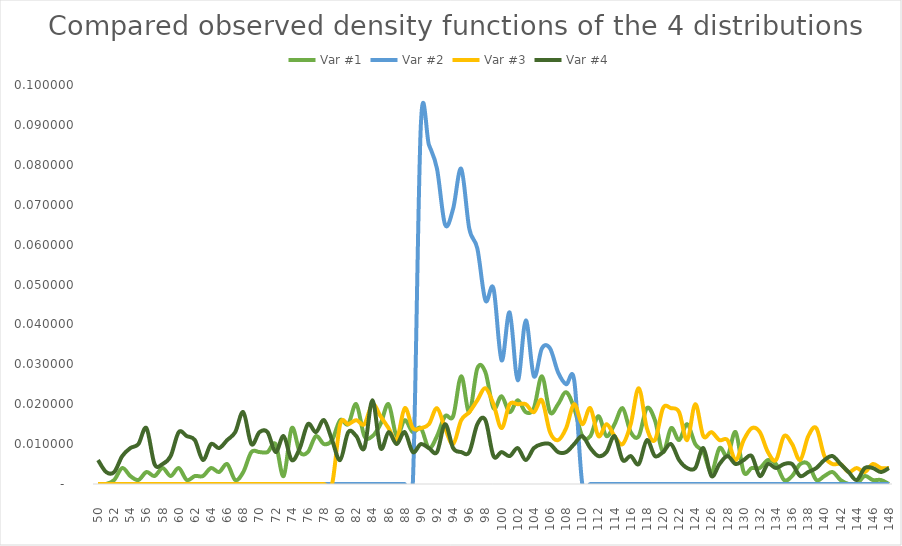
| Category | Var #1 | Var #2 | Var #3 | Var #4 |
|---|---|---|---|---|
| 50.0 | 0 | 0 | 0 | 0.006 |
| 51.0 | 0 | 0 | 0 | 0.003 |
| 52.0 | 0.001 | 0 | 0 | 0.003 |
| 53.0 | 0.004 | 0 | 0 | 0.007 |
| 54.0 | 0.002 | 0 | 0 | 0.009 |
| 55.0 | 0.001 | 0 | 0 | 0.01 |
| 56.0 | 0.003 | 0 | 0 | 0.014 |
| 57.0 | 0.002 | 0 | 0 | 0.005 |
| 58.0 | 0.004 | 0 | 0 | 0.005 |
| 59.0 | 0.002 | 0 | 0 | 0.007 |
| 60.0 | 0.004 | 0 | 0 | 0.013 |
| 61.0 | 0.001 | 0 | 0 | 0.012 |
| 62.0 | 0.002 | 0 | 0 | 0.011 |
| 63.0 | 0.002 | 0 | 0 | 0.006 |
| 64.0 | 0.004 | 0 | 0 | 0.01 |
| 65.0 | 0.003 | 0 | 0 | 0.009 |
| 66.0 | 0.005 | 0 | 0 | 0.011 |
| 67.0 | 0.001 | 0 | 0 | 0.013 |
| 68.0 | 0.003 | 0 | 0 | 0.018 |
| 69.0 | 0.008 | 0 | 0 | 0.01 |
| 70.0 | 0.008 | 0 | 0 | 0.013 |
| 71.0 | 0.008 | 0 | 0 | 0.013 |
| 72.0 | 0.01 | 0 | 0 | 0.008 |
| 73.0 | 0.002 | 0 | 0 | 0.012 |
| 74.0 | 0.014 | 0 | 0 | 0.006 |
| 75.0 | 0.008 | 0 | 0 | 0.009 |
| 76.0 | 0.008 | 0 | 0 | 0.015 |
| 77.0 | 0.012 | 0 | 0 | 0.013 |
| 78.0 | 0.01 | 0 | 0 | 0.016 |
| 79.0 | 0.011 | 0 | 0 | 0.011 |
| 80.0 | 0.016 | 0 | 0.015 | 0.006 |
| 81.0 | 0.015 | 0 | 0.015 | 0.013 |
| 82.0 | 0.02 | 0 | 0.016 | 0.012 |
| 83.0 | 0.012 | 0 | 0.015 | 0.009 |
| 84.0 | 0.012 | 0 | 0.02 | 0.021 |
| 85.0 | 0.015 | 0 | 0.017 | 0.009 |
| 86.0 | 0.02 | 0 | 0.014 | 0.013 |
| 87.0 | 0.012 | 0 | 0.011 | 0.01 |
| 88.0 | 0.016 | 0 | 0.019 | 0.013 |
| 89.0 | 0.013 | 0 | 0.014 | 0.008 |
| 90.0 | 0.014 | 0.09 | 0.014 | 0.01 |
| 91.0 | 0.009 | 0.085 | 0.015 | 0.009 |
| 92.0 | 0.012 | 0.079 | 0.019 | 0.008 |
| 93.0 | 0.017 | 0.065 | 0.014 | 0.015 |
| 94.0 | 0.017 | 0.069 | 0.01 | 0.009 |
| 95.0 | 0.027 | 0.079 | 0.016 | 0.008 |
| 96.0 | 0.018 | 0.064 | 0.018 | 0.008 |
| 97.0 | 0.029 | 0.059 | 0.021 | 0.015 |
| 98.0 | 0.028 | 0.046 | 0.024 | 0.016 |
| 99.0 | 0.019 | 0.049 | 0.02 | 0.007 |
| 100.0 | 0.022 | 0.031 | 0.014 | 0.008 |
| 101.0 | 0.018 | 0.043 | 0.02 | 0.007 |
| 102.0 | 0.021 | 0.026 | 0.02 | 0.009 |
| 103.0 | 0.018 | 0.041 | 0.02 | 0.006 |
| 104.0 | 0.019 | 0.027 | 0.018 | 0.009 |
| 105.0 | 0.027 | 0.034 | 0.021 | 0.01 |
| 106.0 | 0.018 | 0.034 | 0.013 | 0.01 |
| 107.0 | 0.02 | 0.028 | 0.011 | 0.008 |
| 108.0 | 0.023 | 0.025 | 0.014 | 0.008 |
| 109.0 | 0.019 | 0.026 | 0.02 | 0.01 |
| 110.0 | 0.012 | 0 | 0.015 | 0.012 |
| 111.0 | 0.012 | 0 | 0.019 | 0.009 |
| 112.0 | 0.017 | 0 | 0.012 | 0.007 |
| 113.0 | 0.012 | 0 | 0.015 | 0.008 |
| 114.0 | 0.015 | 0 | 0.012 | 0.012 |
| 115.0 | 0.019 | 0 | 0.01 | 0.006 |
| 116.0 | 0.013 | 0 | 0.015 | 0.007 |
| 117.0 | 0.012 | 0 | 0.024 | 0.005 |
| 118.0 | 0.019 | 0 | 0.014 | 0.011 |
| 119.0 | 0.016 | 0 | 0.011 | 0.007 |
| 120.0 | 0.008 | 0 | 0.019 | 0.008 |
| 121.0 | 0.014 | 0 | 0.019 | 0.01 |
| 122.0 | 0.011 | 0 | 0.018 | 0.006 |
| 123.0 | 0.015 | 0 | 0.011 | 0.004 |
| 124.0 | 0.01 | 0 | 0.02 | 0.004 |
| 125.0 | 0.008 | 0 | 0.012 | 0.009 |
| 126.0 | 0.003 | 0 | 0.013 | 0.002 |
| 127.0 | 0.009 | 0 | 0.011 | 0.005 |
| 128.0 | 0.007 | 0 | 0.011 | 0.007 |
| 129.0 | 0.013 | 0 | 0.006 | 0.005 |
| 130.0 | 0.003 | 0 | 0.011 | 0.006 |
| 131.0 | 0.004 | 0 | 0.014 | 0.007 |
| 132.0 | 0.004 | 0 | 0.013 | 0.002 |
| 133.0 | 0.006 | 0 | 0.008 | 0.005 |
| 134.0 | 0.005 | 0 | 0.006 | 0.004 |
| 135.0 | 0.001 | 0 | 0.012 | 0.005 |
| 136.0 | 0.002 | 0 | 0.01 | 0.005 |
| 137.0 | 0.005 | 0 | 0.006 | 0.002 |
| 138.0 | 0.005 | 0 | 0.012 | 0.003 |
| 139.0 | 0.001 | 0 | 0.014 | 0.004 |
| 140.0 | 0.002 | 0 | 0.007 | 0.006 |
| 141.0 | 0.003 | 0 | 0.005 | 0.007 |
| 142.0 | 0.001 | 0 | 0.005 | 0.005 |
| 143.0 | 0 | 0 | 0.003 | 0.003 |
| 144.0 | 0 | 0 | 0.004 | 0.001 |
| 145.0 | 0.002 | 0 | 0.003 | 0.004 |
| 146.0 | 0.001 | 0 | 0.005 | 0.004 |
| 147.0 | 0.001 | 0 | 0.004 | 0.003 |
| 148.0 | 0 | 0 | 0.004 | 0.004 |